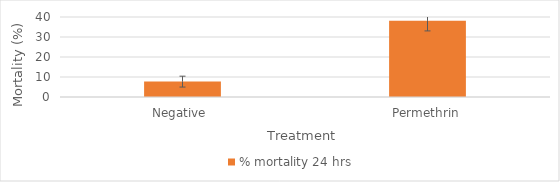
| Category | % mortality 24 hrs |
|---|---|
| Negative  | 7.692 |
| Permethrin | 38.095 |